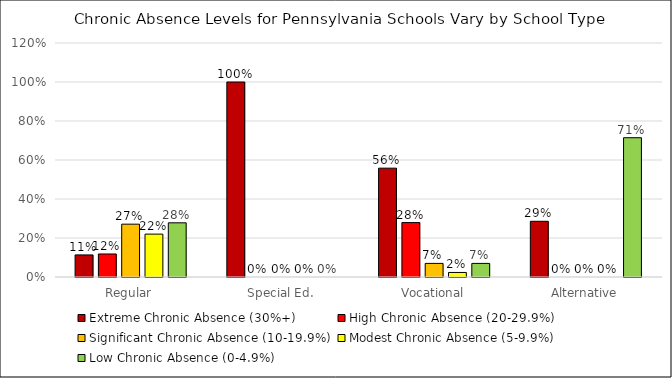
| Category | Extreme Chronic Absence (30%+) | High Chronic Absence (20-29.9%) | Significant Chronic Absence (10-19.9%) | Modest Chronic Absence (5-9.9%) | Low Chronic Absence (0-4.9%) |
|---|---|---|---|---|---|
| Regular | 0.113 | 0.118 | 0.271 | 0.22 | 0.278 |
| Special Ed. | 1 | 0 | 0 | 0 | 0 |
| Vocational | 0.558 | 0.279 | 0.07 | 0.023 | 0.07 |
| Alternative | 0.286 | 0 | 0 | 0 | 0.714 |